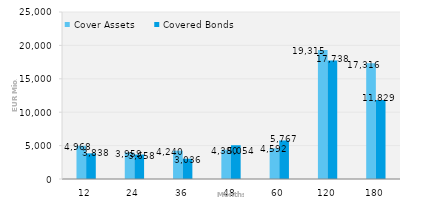
| Category | Cover Assets | Covered Bonds |
|---|---|---|
| 12.0 | 4967.609 | 3838.463 |
| 24.0 | 3958.547 | 3658 |
| 36.0 | 4239.909 | 3035.736 |
| 48.0 | 4379.85 | 5054.233 |
| 60.0 | 4592.463 | 5766.656 |
| 120.0 | 19314.825 | 17737.771 |
| 180.0 | 17315.864 | 11828.624 |